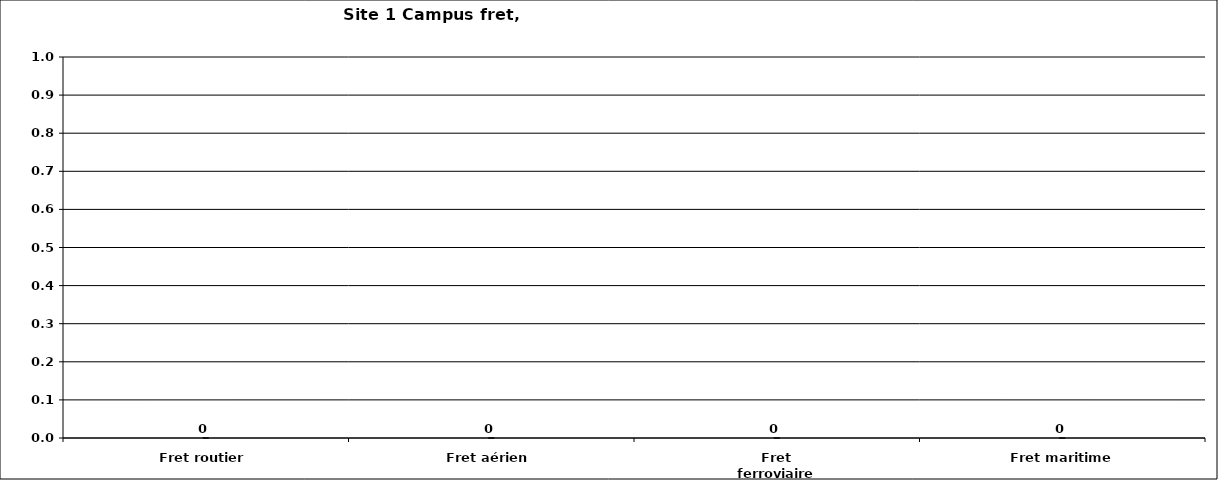
| Category | Series 0 |
|---|---|
| Fret routier | 0 |
| Fret aérien | 0 |
| Fret ferroviaire | 0 |
| Fret maritime | 0 |